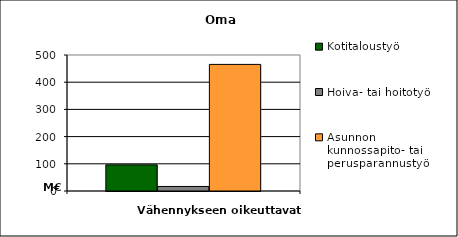
| Category | Kotitaloustyö | Hoiva- tai hoitotyö | Asunnon kunnossapito- tai perusparannustyö |
|---|---|---|---|
| 0 | 96110277.96 | 16706880.48 | 465460718.6 |